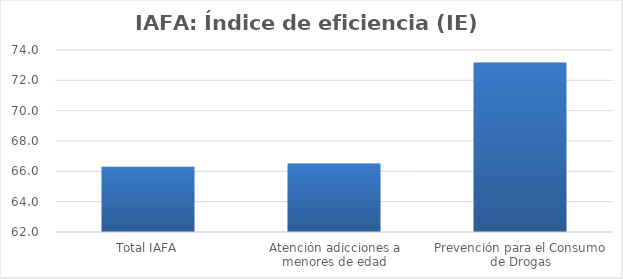
| Category | Índice de eficiencia (IE)  |
|---|---|
| Total IAFA | 66.306 |
| Atención adicciones a menores de edad | 66.515 |
| Prevención para el Consumo de Drogas | 73.173 |